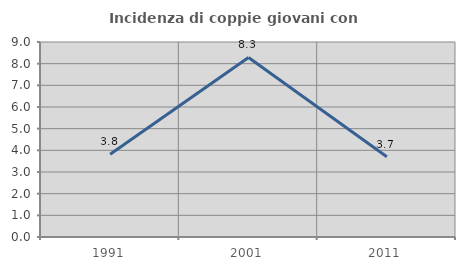
| Category | Incidenza di coppie giovani con figli |
|---|---|
| 1991.0 | 3.822 |
| 2001.0 | 8.287 |
| 2011.0 | 3.704 |